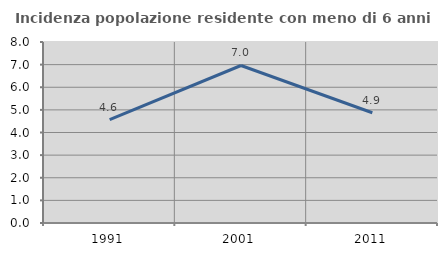
| Category | Incidenza popolazione residente con meno di 6 anni |
|---|---|
| 1991.0 | 4.573 |
| 2001.0 | 6.962 |
| 2011.0 | 4.872 |